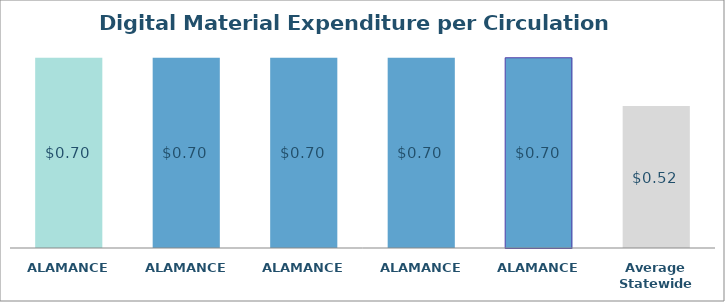
| Category | Series 0 |
|---|---|
| ALAMANCE  | 0.696 |
| ALAMANCE  | 0.696 |
| ALAMANCE  | 0.696 |
| ALAMANCE  | 0.696 |
| ALAMANCE  | 0.696 |
| Average Statewide | 0.519 |